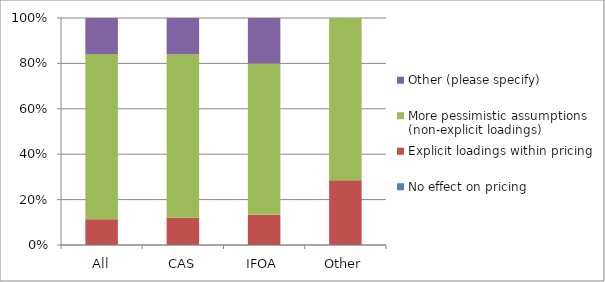
| Category | No effect on pricing | Explicit loadings within pricing | More pessimistic assumptions (non-explicit loadings) | Other (please specify) |
|---|---|---|---|---|
| All | 0 | 0.114 | 0.727 | 0.159 |
| CAS | 0 | 0.12 | 0.72 | 0.16 |
| IFOA | 0 | 0.133 | 0.667 | 0.2 |
| Other | 0 | 0.286 | 0.714 | 0 |